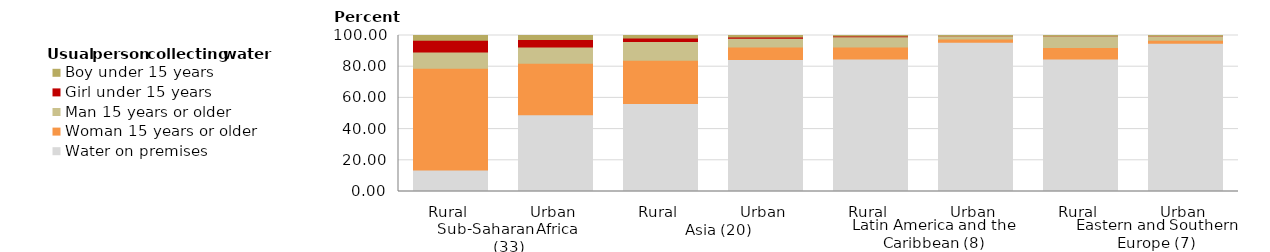
| Category | Water on premises | Woman 15 years or older | Man 15 years or older | Girl under 15 years | Boy under 15 years |
|---|---|---|---|---|---|
| Rural | 13.773 | 65.27 | 10.322 | 7.577 | 3.058 |
| Urban | 49.275 | 33.004 | 10.332 | 4.862 | 2.527 |
| Rural | 56.472 | 27.7 | 11.963 | 2.341 | 1.523 |
| Urban | 84.648 | 7.965 | 5.664 | 0.774 | 0.949 |
| Rural | 84.979 | 7.599 | 6.673 | 0.355 | 0.432 |
| Urban | 95.731 | 2 | 2.042 | 0.093 | 0.134 |
| Rural | 84.894 | 7.408 | 7.46 | 0.107 | 0.13 |
| Urban | 95.101 | 1.909 | 2.897 | 0.022 | 0.072 |